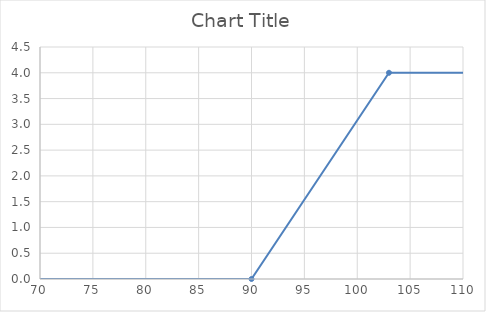
| Category | Series 0 |
|---|---|
| 0.0 | 0 |
| 90.0 | 0 |
| 103.0 | 4 |
| 150.0 | 4 |